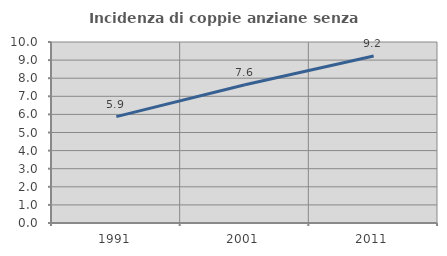
| Category | Incidenza di coppie anziane senza figli  |
|---|---|
| 1991.0 | 5.878 |
| 2001.0 | 7.638 |
| 2011.0 | 9.224 |